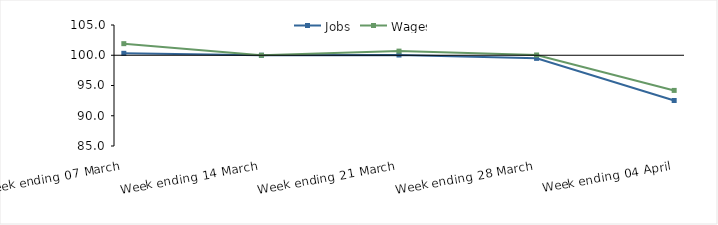
| Category | Jobs | Wages |
|---|---|---|
| 0 | 100.32 | 101.914 |
| 1900-01-01 | 100 | 100 |
| 1900-01-02 | 100.041 | 100.682 |
| 1900-01-03 | 99.485 | 100.046 |
| 1900-01-04 | 92.52 | 94.188 |